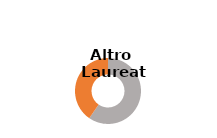
| Category | Series 0 |
|---|---|
| Donne  | 0.596 |
| Uomini  | 0.404 |